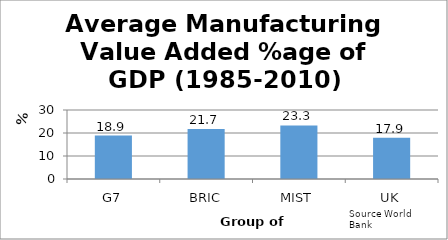
| Category | Average Value Added %age of GDP |
|---|---|
| G7 | 18.9 |
| BRIC | 21.7 |
| MIST | 23.3 |
| UK | 17.9 |